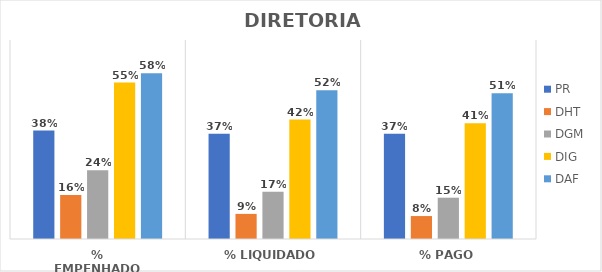
| Category | PR | DHT | DGM | DIG | DAF |
|---|---|---|---|---|---|
| % EMPENHADO | 0.382 | 0.155 | 0.242 | 0.55 | 0.583 |
| % LIQUIDADO | 0.37 | 0.088 | 0.166 | 0.42 | 0.523 |
| % PAGO | 0.37 | 0.081 | 0.145 | 0.407 | 0.513 |